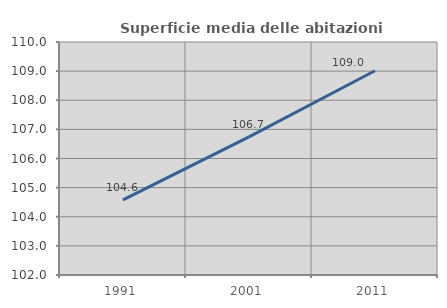
| Category | Superficie media delle abitazioni occupate |
|---|---|
| 1991.0 | 104.582 |
| 2001.0 | 106.742 |
| 2011.0 | 109.012 |